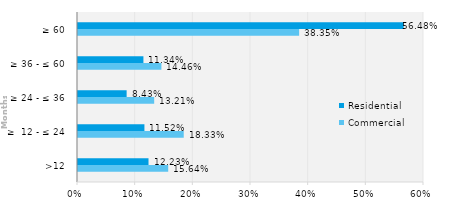
| Category | Commercial | Residential |
|---|---|---|
| >12 | 0.156 | 0.122 |
| ≥  12 - ≤ 24 | 0.183 | 0.115 |
| ≥ 24 - ≤ 36 | 0.132 | 0.084 |
| ≥ 36 - ≤ 60 | 0.145 | 0.113 |
| ≥ 60 | 0.383 | 0.565 |